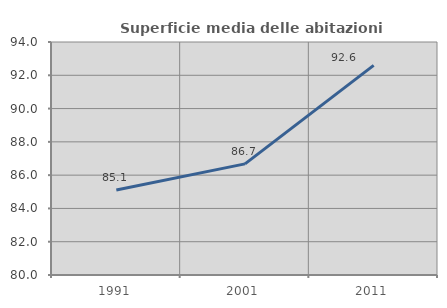
| Category | Superficie media delle abitazioni occupate |
|---|---|
| 1991.0 | 85.104 |
| 2001.0 | 86.677 |
| 2011.0 | 92.595 |